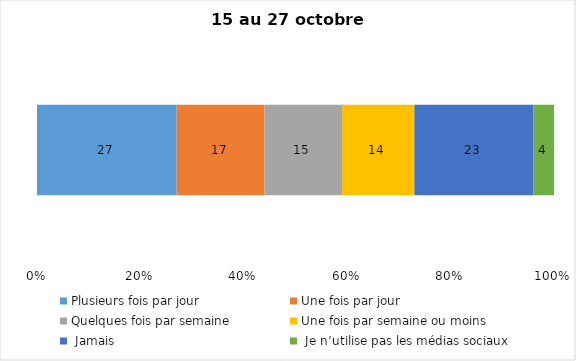
| Category | Plusieurs fois par jour | Une fois par jour | Quelques fois par semaine   | Une fois par semaine ou moins   |  Jamais   |  Je n’utilise pas les médias sociaux |
|---|---|---|---|---|---|---|
| 0 | 27 | 17 | 15 | 14 | 23 | 4 |